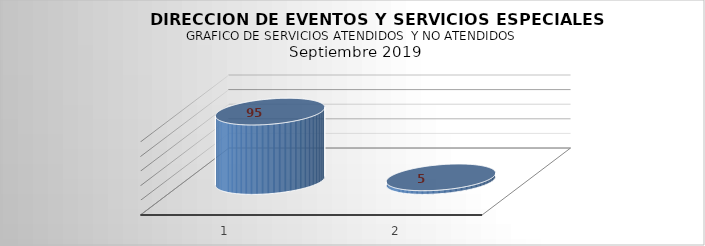
| Category | Series 0 |
|---|---|
| 0 | 95 |
| 1 | 5 |